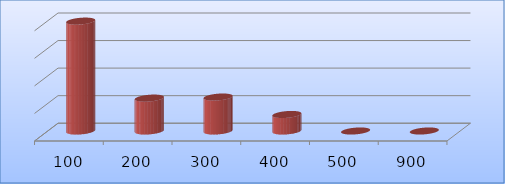
| Category | Series 0 |
|---|---|
| 100.0 | 19938169 |
| 200.0 | 5968488 |
| 300.0 | 6162300 |
| 400.0 | 3000000 |
| 500.0 | 0 |
| 900.0 | 0 |